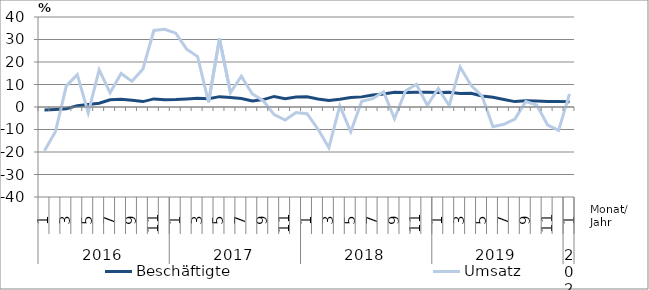
| Category | Beschäftigte | Umsatz |
|---|---|---|
| 0 | -1.3 | -19.4 |
| 1 | -1.1 | -11 |
| 2 | -0.8 | 9.4 |
| 3 | 0.6 | 14.4 |
| 4 | 1.1 | -2.6 |
| 5 | 1.7 | 16.5 |
| 6 | 3.2 | 6.3 |
| 7 | 3.4 | 14.9 |
| 8 | 3 | 11.4 |
| 9 | 2.4 | 16.9 |
| 10 | 3.6 | 34 |
| 11 | 3.2 | 34.5 |
| 12 | 3.3 | 32.8 |
| 13 | 3.6 | 25.7 |
| 14 | 3.9 | 22.4 |
| 15 | 3.7 | 2.1 |
| 16 | 4.6 | 30.4 |
| 17 | 4.2 | 6.4 |
| 18 | 3.8 | 13.7 |
| 19 | 2.7 | 5.8 |
| 20 | 3.3 | 2.8 |
| 21 | 4.7 | -3.4 |
| 22 | 3.7 | -5.8 |
| 23 | 4.4 | -2.5 |
| 24 | 4.5 | -3 |
| 25 | 3.6 | -9.8 |
| 26 | 2.9 | -18.1 |
| 27 | 3.4 | 0.5 |
| 28 | 4.2 | -11 |
| 29 | 4.5 | 2.5 |
| 30 | 5.3 | 3.7 |
| 31 | 5.8 | 6.8 |
| 32 | 6.6 | -5.2 |
| 33 | 6.5 | 7.1 |
| 34 | 6.6 | 10.1 |
| 35 | 6.6 | 0.8 |
| 36 | 6.4 | 8.2 |
| 37 | 6.5 | 0.6 |
| 38 | 6 | 17.8 |
| 39 | 6.1 | 9.6 |
| 40 | 4.9 | 4.9 |
| 41 | 4.3 | -8.8 |
| 42 | 3.3 | -7.7 |
| 43 | 2.4 | -5.4 |
| 44 | 2.8 | 2.4 |
| 45 | 2.7 | 0.9 |
| 46 | 2.5 | -8 |
| 47 | 2.5 | -10.4 |
| 48 | 2.3 | 5.8 |